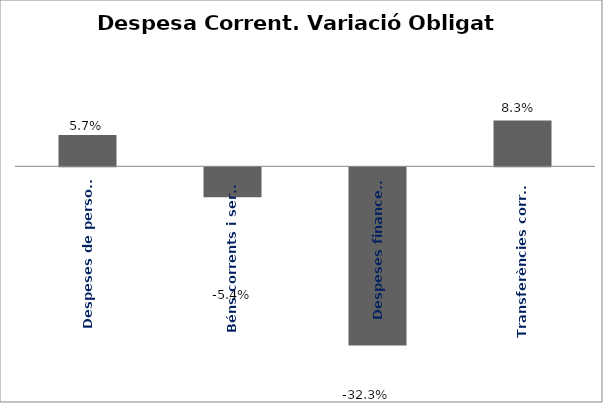
| Category | Series 0 |
|---|---|
| Despeses de personal | 0.057 |
| Béns corrents i serveis | -0.054 |
| Despeses financeres | -0.323 |
| Transferències corrents | 0.083 |